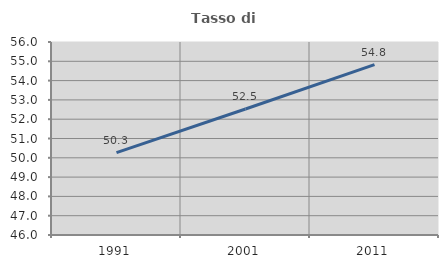
| Category | Tasso di occupazione   |
|---|---|
| 1991.0 | 50.27 |
| 2001.0 | 52.53 |
| 2011.0 | 54.83 |